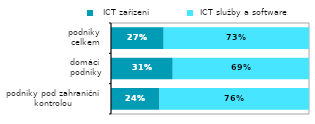
| Category |   ICT zařízení |  ICT služby a software |
|---|---|---|
| podniky pod zahraniční 
kontrolou | 0.245 | 0.755 |
| domácí 
podniky | 0.312 | 0.688 |
| podniky 
celkem | 0.266 | 0.734 |